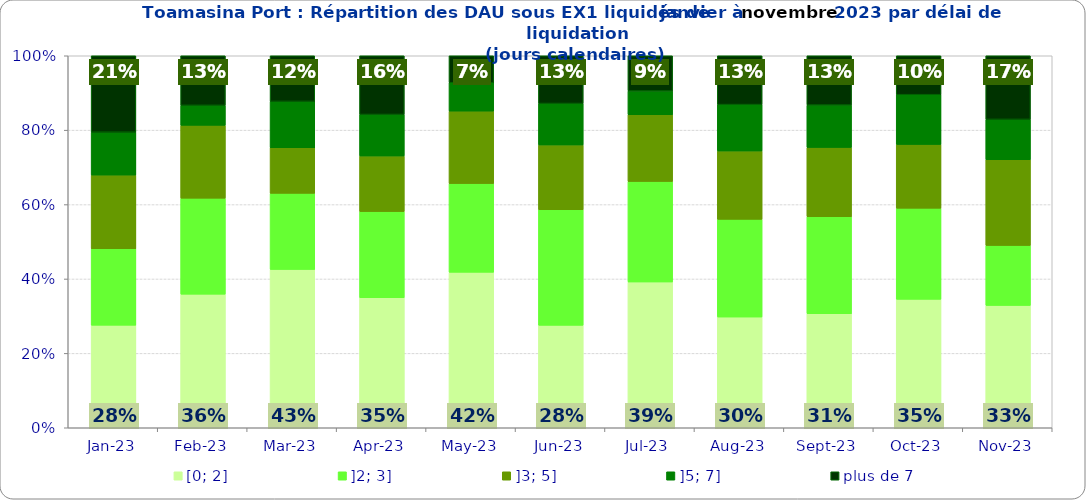
| Category | [0; 2] | ]2; 3] | ]3; 5] | ]5; 7] | plus de 7 |
|---|---|---|---|---|---|
| 2023-01-01 | 0.276 | 0.206 | 0.198 | 0.115 | 0.206 |
| 2023-02-01 | 0.359 | 0.258 | 0.196 | 0.054 | 0.133 |
| 2023-03-01 | 0.426 | 0.204 | 0.123 | 0.125 | 0.123 |
| 2023-04-01 | 0.349 | 0.232 | 0.149 | 0.112 | 0.158 |
| 2023-05-01 | 0.418 | 0.239 | 0.195 | 0.076 | 0.073 |
| 2023-06-01 | 0.275 | 0.311 | 0.174 | 0.111 | 0.128 |
| 2023-07-01 | 0.392 | 0.27 | 0.18 | 0.064 | 0.095 |
| 2023-08-01 | 0.298 | 0.263 | 0.184 | 0.125 | 0.131 |
| 2023-09-01 | 0.306 | 0.261 | 0.186 | 0.114 | 0.133 |
| 2023-10-01 | 0.345 | 0.245 | 0.171 | 0.134 | 0.105 |
| 2023-11-01 | 0.329 | 0.161 | 0.23 | 0.109 | 0.171 |